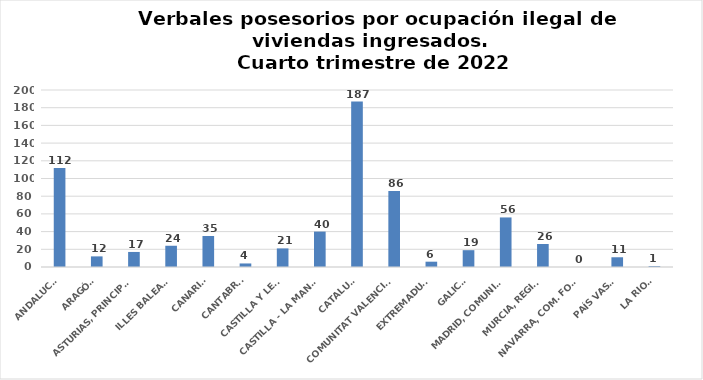
| Category | Series 0 |
|---|---|
| ANDALUCÍA | 112 |
| ARAGÓN | 12 |
| ASTURIAS, PRINCIPADO | 17 |
| ILLES BALEARS | 24 |
| CANARIAS | 35 |
| CANTABRIA | 4 |
| CASTILLA Y LEÓN | 21 |
| CASTILLA - LA MANCHA | 40 |
| CATALUÑA | 187 |
| COMUNITAT VALENCIANA | 86 |
| EXTREMADURA | 6 |
| GALICIA | 19 |
| MADRID, COMUNIDAD | 56 |
| MURCIA, REGIÓN | 26 |
| NAVARRA, COM. FORAL | 0 |
| PAÍS VASCO | 11 |
| LA RIOJA | 1 |